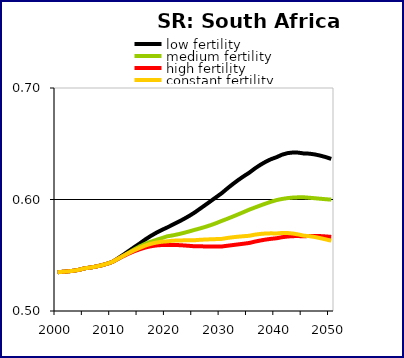
| Category | low fertility | medium fertility | high fertility | constant fertility |
|---|---|---|---|---|
| 2000.0 | 0.535 | 0.535 | 0.535 | 0.535 |
| 2001.0 | 0.535 | 0.535 | 0.535 | 0.535 |
| 2002.0 | 0.536 | 0.536 | 0.536 | 0.536 |
| 2003.0 | 0.536 | 0.536 | 0.536 | 0.536 |
| 2004.0 | 0.537 | 0.537 | 0.537 | 0.537 |
| 2005.0 | 0.538 | 0.538 | 0.538 | 0.538 |
| 2006.0 | 0.539 | 0.539 | 0.539 | 0.539 |
| 2007.0 | 0.54 | 0.54 | 0.54 | 0.54 |
| 2008.0 | 0.541 | 0.541 | 0.541 | 0.541 |
| 2009.0 | 0.542 | 0.542 | 0.542 | 0.542 |
| 2010.0 | 0.544 | 0.544 | 0.544 | 0.544 |
| 2011.0 | 0.547 | 0.547 | 0.547 | 0.547 |
| 2012.0 | 0.55 | 0.549 | 0.549 | 0.55 |
| 2013.0 | 0.554 | 0.552 | 0.552 | 0.552 |
| 2014.0 | 0.557 | 0.555 | 0.554 | 0.554 |
| 2015.0 | 0.561 | 0.558 | 0.555 | 0.557 |
| 2016.0 | 0.564 | 0.56 | 0.557 | 0.559 |
| 2017.0 | 0.567 | 0.562 | 0.558 | 0.56 |
| 2018.0 | 0.57 | 0.564 | 0.559 | 0.561 |
| 2019.0 | 0.573 | 0.565 | 0.559 | 0.562 |
| 2020.0 | 0.575 | 0.567 | 0.559 | 0.562 |
| 2021.0 | 0.577 | 0.568 | 0.559 | 0.563 |
| 2022.0 | 0.58 | 0.569 | 0.559 | 0.563 |
| 2023.0 | 0.582 | 0.57 | 0.559 | 0.563 |
| 2024.0 | 0.585 | 0.571 | 0.558 | 0.563 |
| 2025.0 | 0.588 | 0.573 | 0.558 | 0.563 |
| 2026.0 | 0.592 | 0.574 | 0.558 | 0.564 |
| 2027.0 | 0.595 | 0.575 | 0.558 | 0.564 |
| 2028.0 | 0.599 | 0.577 | 0.558 | 0.564 |
| 2029.0 | 0.602 | 0.579 | 0.558 | 0.564 |
| 2030.0 | 0.606 | 0.581 | 0.558 | 0.565 |
| 2031.0 | 0.61 | 0.583 | 0.559 | 0.566 |
| 2032.0 | 0.614 | 0.585 | 0.559 | 0.566 |
| 2033.0 | 0.617 | 0.587 | 0.56 | 0.567 |
| 2034.0 | 0.621 | 0.589 | 0.56 | 0.567 |
| 2035.0 | 0.624 | 0.591 | 0.561 | 0.567 |
| 2036.0 | 0.628 | 0.593 | 0.562 | 0.568 |
| 2037.0 | 0.631 | 0.595 | 0.563 | 0.569 |
| 2038.0 | 0.634 | 0.596 | 0.564 | 0.569 |
| 2039.0 | 0.636 | 0.598 | 0.565 | 0.57 |
| 2040.0 | 0.638 | 0.599 | 0.565 | 0.57 |
| 2041.0 | 0.64 | 0.6 | 0.566 | 0.57 |
| 2042.0 | 0.642 | 0.601 | 0.567 | 0.57 |
| 2043.0 | 0.642 | 0.602 | 0.567 | 0.569 |
| 2044.0 | 0.642 | 0.602 | 0.567 | 0.569 |
| 2045.0 | 0.641 | 0.602 | 0.567 | 0.568 |
| 2046.0 | 0.641 | 0.602 | 0.567 | 0.567 |
| 2047.0 | 0.64 | 0.601 | 0.567 | 0.566 |
| 2048.0 | 0.639 | 0.601 | 0.567 | 0.565 |
| 2049.0 | 0.638 | 0.6 | 0.567 | 0.564 |
| 2050.0 | 0.636 | 0.6 | 0.566 | 0.563 |